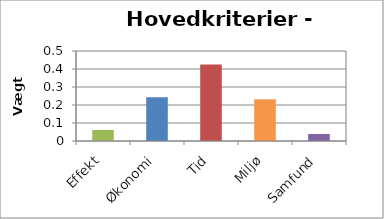
| Category | Vægt 2 |
|---|---|
| Effekt | 0.061 |
| Økonomi | 0.243 |
| Tid | 0.425 |
| Miljø | 0.232 |
| Samfund | 0.039 |